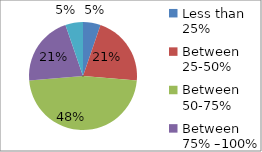
| Category | Series 0 |
|---|---|
| Less than 25%  | 0.053 |
| Between 25-50%  | 0.211 |
| Between 50-75%  | 0.474 |
| Between 75% –100%  | 0.211 |
| More than 100%  | 0.053 |